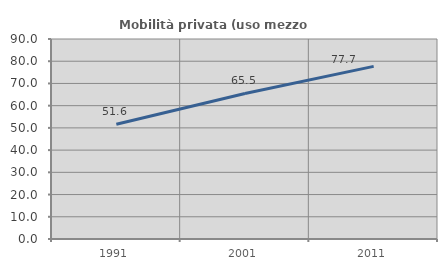
| Category | Mobilità privata (uso mezzo privato) |
|---|---|
| 1991.0 | 51.63 |
| 2001.0 | 65.505 |
| 2011.0 | 77.685 |